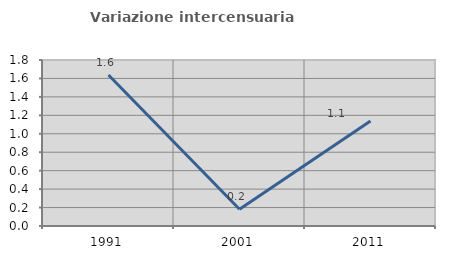
| Category | Variazione intercensuaria annua |
|---|---|
| 1991.0 | 1.637 |
| 2001.0 | 0.182 |
| 2011.0 | 1.139 |